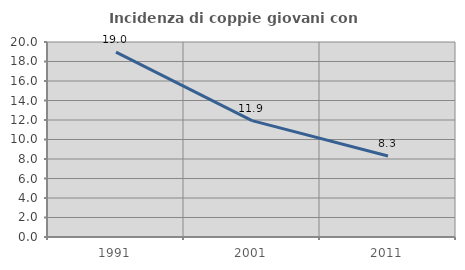
| Category | Incidenza di coppie giovani con figli |
|---|---|
| 1991.0 | 18.956 |
| 2001.0 | 11.932 |
| 2011.0 | 8.307 |